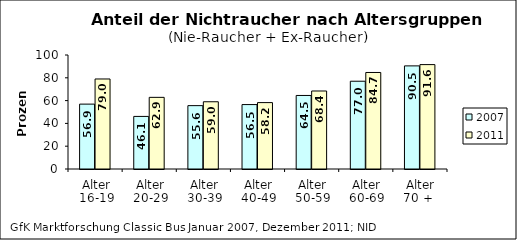
| Category | 2007 | 2011 |
|---|---|---|
| Alter
16-19 | 56.911 | 78.967 |
| Alter
20-29 | 46.122 | 62.855 |
| Alter
30-39 | 55.59 | 58.979 |
| Alter
40-49 | 56.522 | 58.24 |
| Alter
50-59 | 64.505 | 68.429 |
| Alter
60-69 | 76.994 | 84.668 |
| Alter
70 +  | 90.461 | 91.577 |